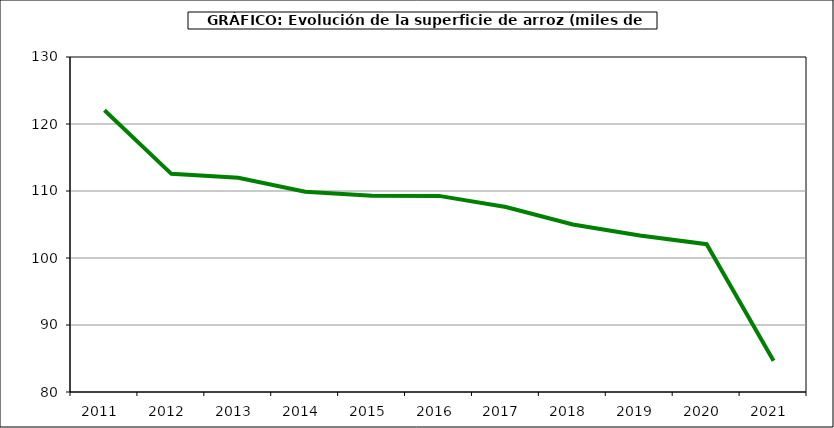
| Category | Superficie |
|---|---|
| 2011.0 | 122.058 |
| 2012.0 | 112.557 |
| 2013.0 | 111.984 |
| 2014.0 | 109.889 |
| 2015.0 | 109.29 |
| 2016.0 | 109.272 |
| 2017.0 | 107.604 |
| 2018.0 | 105.012 |
| 2019.0 | 103.367 |
| 2020.0 | 102.064 |
| 2021.0 | 84.678 |